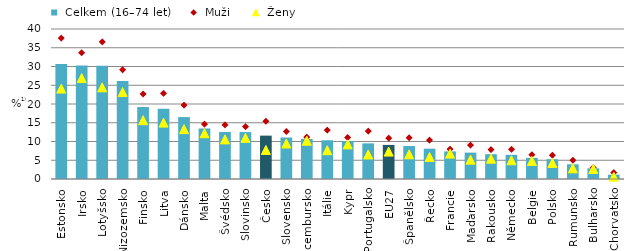
| Category |  Celkem (16–74 let) |
|---|---|
| Estonsko | 30.68 |
| Irsko | 30.243 |
| Lotyšsko | 30.2 |
| Nizozemsko | 26.147 |
| Finsko | 19.191 |
| Litva | 18.747 |
| Dánsko | 16.512 |
| Malta | 13.474 |
| Švédsko | 12.537 |
| Slovinsko | 12.513 |
| Česko | 11.567 |
| Slovensko | 11.061 |
| Lucembursko | 10.692 |
| Itálie | 10.327 |
| Kypr | 10.124 |
| Portugalsko | 9.504 |
| EU27 | 9.089 |
| Španělsko | 8.789 |
| Řecko | 8.081 |
| Francie | 7.356 |
| Maďarsko | 7.038 |
| Rakousko | 6.608 |
| Německo | 6.442 |
| Belgie | 5.629 |
| Polsko | 5.275 |
| Rumunsko | 3.912 |
| Bulharsko | 2.844 |
| Chorvatsko | 1.144 |